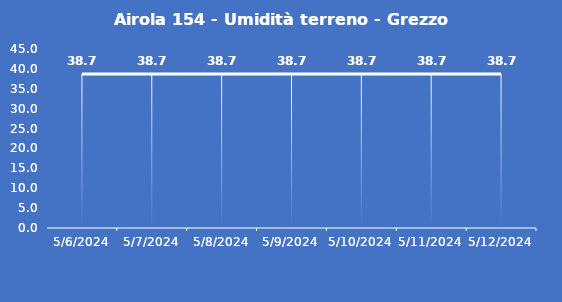
| Category | Airola 154 - Umidità terreno - Grezzo (%VWC) |
|---|---|
| 5/6/24 | 38.7 |
| 5/7/24 | 38.7 |
| 5/8/24 | 38.7 |
| 5/9/24 | 38.7 |
| 5/10/24 | 38.7 |
| 5/11/24 | 38.7 |
| 5/12/24 | 38.7 |